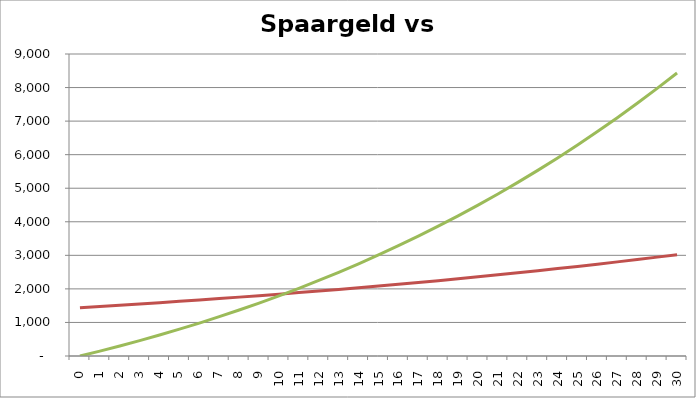
| Category | Spaargeld zonder panelen (incl rente) | Spaargeld bij panelen |
|---|---|---|
| 0.0 | 1440 | 0 |
| 1.0 | 1476 | 145.873 |
| 2.0 | 1512.9 | 298.525 |
| 3.0 | 1550.722 | 458.184 |
| 4.0 | 1589.491 | 625.08 |
| 5.0 | 1629.228 | 799.453 |
| 6.0 | 1669.959 | 981.549 |
| 7.0 | 1711.707 | 1171.618 |
| 8.0 | 1754.5 | 1369.921 |
| 9.0 | 1798.363 | 1576.722 |
| 10.0 | 1843.322 | 1792.295 |
| 11.0 | 1889.405 | 2016.919 |
| 12.0 | 1936.64 | 2250.882 |
| 13.0 | 1985.056 | 2494.48 |
| 14.0 | 2034.682 | 2748.014 |
| 15.0 | 2085.549 | 3011.796 |
| 16.0 | 2137.688 | 3286.144 |
| 17.0 | 2191.13 | 3571.385 |
| 18.0 | 2245.909 | 3867.854 |
| 19.0 | 2302.056 | 4175.895 |
| 20.0 | 2359.608 | 4495.861 |
| 21.0 | 2418.598 | 4828.112 |
| 22.0 | 2479.063 | 5173.02 |
| 23.0 | 2541.039 | 5530.964 |
| 24.0 | 2604.565 | 5902.332 |
| 25.0 | 2669.68 | 6287.523 |
| 26.0 | 2736.421 | 6686.945 |
| 27.0 | 2804.832 | 7101.016 |
| 28.0 | 2874.953 | 7530.164 |
| 29.0 | 2946.827 | 7974.828 |
| 30.0 | 3020.497 | 8435.455 |